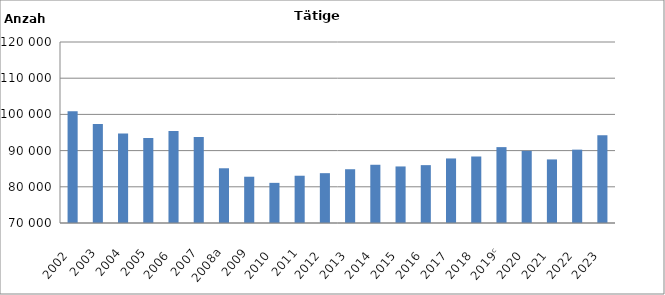
| Category | Series 0 |
|---|---|
| 2002  | 100868 |
| 2003 | 97367 |
| 2004 | 94725 |
| 2005 | 93496 |
| 2006  | 95427 |
| 2007 | 93755 |
| 2008a | 85118 |
| 2009 | 82782 |
| 2010  | 81089 |
| 2011 | 83058 |
| 2012  | 83766 |
| 2013  | 84853 |
| 2014  | 86087 |
| 2015  | 85622 |
| 2016  | 85986 |
| 2017  | 87831 |
| 2018  | 88371 |
| 2019ᶜ | 90961 |
| 2020  | 89928 |
| 2021  | 87564 |
| 2022  | 90266 |
| 2023  | 94260 |